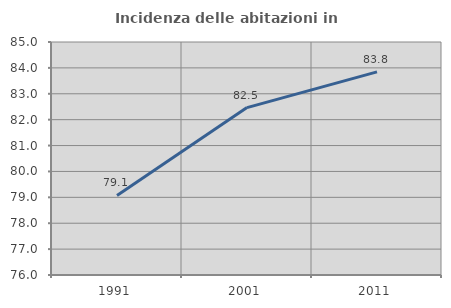
| Category | Incidenza delle abitazioni in proprietà  |
|---|---|
| 1991.0 | 79.074 |
| 2001.0 | 82.466 |
| 2011.0 | 83.845 |